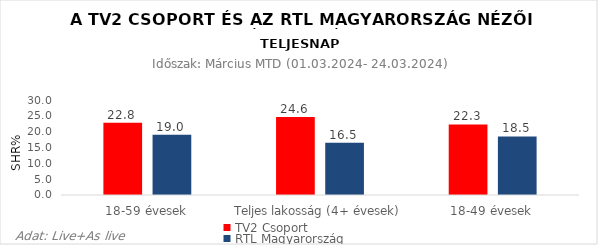
| Category | TV2 Csoport | RTL Magyarország |
|---|---|---|
| 18-59 évesek | 22.8 | 19 |
| Teljes lakosság (4+ évesek) | 24.6 | 16.5 |
| 18-49 évesek | 22.3 | 18.5 |